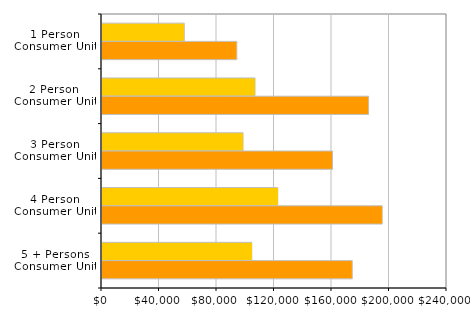
| Category | 2000 | 2010 |
|---|---|---|
| 1 Person
Consumer Unit | 57221 | 93774 |
| 2 Person 
Consumer Unit | 106434 | 185485 |
| 3 Person
Consumer Unit | 98105 | 160367 |
| 4 Person
Consumer Unit | 122235 | 194932 |
| 5 + Persons
Consumer Unit | 104164 | 174072 |